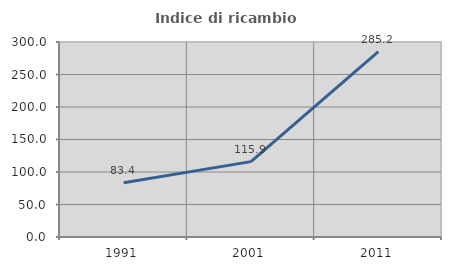
| Category | Indice di ricambio occupazionale  |
|---|---|
| 1991.0 | 83.378 |
| 2001.0 | 115.935 |
| 2011.0 | 285.227 |